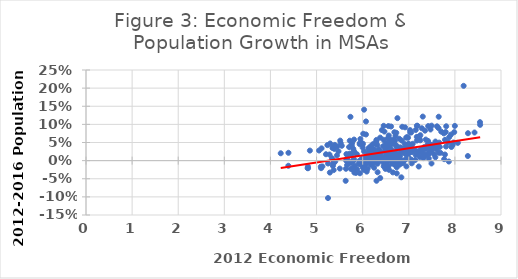
| Category | 2012-2016 Population Growth |
|---|---|
| 8.547669605840008 | 0.099 |
| 8.544558031174619 | 0.106 |
| 8.425552058119893 | 0.078 |
| 8.283765208355723 | 0.076 |
| 8.281198991280146 | 0.013 |
| 8.189887445923729 | 0.206 |
| 8.063717157255343 | 0.049 |
| 7.999061720572577 | 0.096 |
| 7.985514811354089 | 0.079 |
| 7.968329418094857 | 0.05 |
| 7.950647965060045 | 0.043 |
| 7.924628891524489 | 0.038 |
| 7.915038877419981 | 0.072 |
| 7.876693366457638 | 0.065 |
| 7.86836399496796 | -0.002 |
| 7.857229789867226 | 0.051 |
| 7.811855775583378 | 0.095 |
| 7.808392113529277 | 0.039 |
| 7.800807401070361 | 0.079 |
| 7.7856779822019915 | 0.057 |
| 7.784297718168427 | 0.017 |
| 7.76802720747049 | 0.004 |
| 7.76130980271395 | 0.075 |
| 7.703692062331889 | 0.08 |
| 7.68798869664089 | 0.022 |
| 7.672542301662936 | 0.038 |
| 7.659852269930613 | 0.05 |
| 7.649049603527929 | 0.121 |
| 7.6463544825522005 | 0.09 |
| 7.645356883772604 | 0.022 |
| 7.631316115166338 | 0.044 |
| 7.612484425216233 | 0.095 |
| 7.605202185658097 | 0.031 |
| 7.593386969901714 | 0.036 |
| 7.5783485359729355 | 0.053 |
| 7.57633929768339 | 0.009 |
| 7.5475867676369495 | 0.018 |
| 7.514120883301267 | 0.043 |
| 7.508226858432672 | 0.03 |
| 7.505839011236856 | 0.041 |
| 7.495153093302373 | 0.096 |
| 7.4927283026379 | -0.008 |
| 7.475423852071773 | 0.025 |
| 7.471544550846338 | 0.086 |
| 7.466157010850199 | 0.045 |
| 7.44808455889028 | 0.033 |
| 7.446167987069555 | 0.022 |
| 7.434300881554347 | 0.006 |
| 7.427764579528637 | 0.018 |
| 7.421302916763621 | 0.095 |
| 7.417797387675208 | 0.054 |
| 7.4175763491399564 | 0.018 |
| 7.412345754365745 | 0.046 |
| 7.375841914394948 | 0.032 |
| 7.367595836876464 | 0.058 |
| 7.360267132458676 | 0.014 |
| 7.351907599767382 | 0.083 |
| 7.3469118442699894 | 0.016 |
| 7.346394580717287 | 0.017 |
| 7.331465079610901 | 0.037 |
| 7.327701090492096 | 0.011 |
| 7.315223207024147 | 0.007 |
| 7.3137798713008495 | 0.029 |
| 7.311078226762 | 0.032 |
| 7.303639480430417 | 0.121 |
| 7.297022599344106 | 0.019 |
| 7.28350548262397 | 0.089 |
| 7.2662860216238805 | 0.032 |
| 7.2510288073399805 | 0.07 |
| 7.249495159921824 | 0.056 |
| 7.238424254905876 | 0.01 |
| 7.238014128534135 | 0.025 |
| 7.228785146976698 | 0.062 |
| 7.216069384420103 | -0.016 |
| 7.201415285089325 | 0.065 |
| 7.198617963042934 | 0.021 |
| 7.187433268926689 | 0.096 |
| 7.183200584834012 | 0.026 |
| 7.175527467051642 | 0.096 |
| 7.175362579276819 | 0.055 |
| 7.17402362464856 | 0.065 |
| 7.151040885092672 | 0.085 |
| 7.149792978851026 | 0.016 |
| 7.137467368012082 | 0.002 |
| 7.117897161098003 | 0.031 |
| 7.085226669010072 | 0.046 |
| 7.070506973346759 | 0.024 |
| 7.065093940520967 | -0.007 |
| 7.055343317890174 | 0.003 |
| 7.052434076570314 | 0.078 |
| 7.047514976771905 | 0.036 |
| 7.037143794303165 | 0.032 |
| 7.032391015710448 | 0.042 |
| 7.030134270597512 | 0.078 |
| 7.03004587106111 | 0.024 |
| 7.028730537199991 | 0.084 |
| 7.025341088699817 | 0.002 |
| 7.012577109296752 | 0.023 |
| 7.001533597818828 | 0.047 |
| 6.9948245898559405 | 0.031 |
| 6.991969155392204 | 0.009 |
| 6.991484366961411 | 0.024 |
| 6.98800452388469 | 0.019 |
| 6.9874308370614 | 0.008 |
| 6.984529803917301 | 0.063 |
| 6.979498012937747 | 0.045 |
| 6.963399462349867 | 0.039 |
| 6.961431166691342 | 0.065 |
| 6.948406250728984 | -0.016 |
| 6.9438587724735 | 0.063 |
| 6.934556178911188 | 0.018 |
| 6.932207004158857 | 0.004 |
| 6.920453597990068 | 0.092 |
| 6.9181771233803735 | 0.045 |
| 6.913835101646896 | 0.026 |
| 6.913390513714955 | 0.033 |
| 6.9014718608312515 | 0.032 |
| 6.896462780784286 | 0 |
| 6.884849224660805 | 0.023 |
| 6.876605275658889 | -0.006 |
| 6.870347723793235 | -0.001 |
| 6.8687135238847645 | 0.023 |
| 6.861958220338586 | 0.032 |
| 6.857908693648871 | 0.093 |
| 6.851856641075114 | 0.055 |
| 6.850998417731019 | -0.007 |
| 6.839001400390121 | -0.046 |
| 6.829329968863719 | 0.028 |
| 6.823510014047835 | 0.036 |
| 6.81521813401784 | 0.001 |
| 6.8138071406698115 | 0.036 |
| 6.811168908091095 | 0.012 |
| 6.801522815642833 | -0.011 |
| 6.795660789281947 | 0.06 |
| 6.793772711775245 | 0.019 |
| 6.782890427894834 | 0.004 |
| 6.7611498104793855 | 0.007 |
| 6.754582241184242 | -0.003 |
| 6.754060758298377 | 0.117 |
| 6.751582841808173 | 0.039 |
| 6.744478594480946 | 0.035 |
| 6.739628625823966 | -0.018 |
| 6.739572222222448 | -0.035 |
| 6.736763896285094 | -0.003 |
| 6.7298627355306335 | 0.077 |
| 6.715053123041834 | -0.013 |
| 6.713334165825381 | 0.015 |
| 6.711864027256374 | 0.068 |
| 6.709627885846807 | 0.044 |
| 6.709356486702831 | 0.013 |
| 6.708841848423039 | 0.022 |
| 6.70575354968313 | 0.007 |
| 6.696538571825786 | 0.054 |
| 6.696137444951894 | -0.007 |
| 6.696109404816949 | 0.024 |
| 6.6923160062602705 | 0.003 |
| 6.68947085059447 | -0.011 |
| 6.68721867504465 | 0.078 |
| 6.684653109790052 | -0.007 |
| 6.681065631811428 | 0.051 |
| 6.678379827378461 | 0.058 |
| 6.673988409514358 | 0.003 |
| 6.671365262111656 | 0.047 |
| 6.659532807539173 | 0.02 |
| 6.654410596778966 | -0.032 |
| 6.639025939684324 | -0.008 |
| 6.6383614781645015 | 0.007 |
| 6.636832294079466 | -0.003 |
| 6.629280514625708 | 0.024 |
| 6.627766938049625 | 0.023 |
| 6.624202590111893 | 0.001 |
| 6.6232207294376595 | -0.003 |
| 6.622824888618836 | 0.016 |
| 6.622247656752414 | 0.031 |
| 6.615939910463024 | 0.094 |
| 6.614612807717717 | 0.013 |
| 6.6132154479218 | 0.009 |
| 6.608852681213907 | 0.057 |
| 6.600584247296536 | 0.025 |
| 6.59912089079814 | 0.046 |
| 6.598645800663072 | 0.043 |
| 6.5844595886375785 | 0.016 |
| 6.582209204093805 | 0.007 |
| 6.581900834686395 | 0.058 |
| 6.578331114508092 | 0.003 |
| 6.573094011985204 | 0.045 |
| 6.570532596701438 | -0.025 |
| 6.5665906802321805 | 0.069 |
| 6.566186251874167 | 0.024 |
| 6.56599605723715 | 0.005 |
| 6.562295656590735 | 0.014 |
| 6.558895413756709 | 0.095 |
| 6.556502877083738 | -0.016 |
| 6.552819052197266 | 0.023 |
| 6.549004634115426 | 0.062 |
| 6.545999186145565 | 0.017 |
| 6.5447870787016456 | 0.038 |
| 6.542807663177058 | -0.016 |
| 6.54130789233603 | 0.008 |
| 6.534291683719515 | -0.018 |
| 6.528855557052598 | 0.024 |
| 6.527993973802102 | 0.046 |
| 6.524734763173842 | 0.044 |
| 6.520235355919156 | -0.011 |
| 6.519932288043997 | -0.005 |
| 6.518834900178553 | -0.015 |
| 6.517810813246061 | 0.038 |
| 6.5124297587767375 | -0.019 |
| 6.503930241051635 | 0.016 |
| 6.498084618038604 | 0.039 |
| 6.4977267763609765 | 0.049 |
| 6.494920600823529 | 0.03 |
| 6.494804013885098 | -0.023 |
| 6.489364327137849 | 0.029 |
| 6.472325470704257 | 0.08 |
| 6.468261006353999 | -0.011 |
| 6.46825344674792 | 0.001 |
| 6.456825566649165 | -0.016 |
| 6.45604711333701 | 0.096 |
| 6.453542289036636 | 0.058 |
| 6.4434326896779766 | 0.008 |
| 6.442463259279781 | 0.04 |
| 6.441280535471677 | 0.003 |
| 6.438179326172089 | 0.006 |
| 6.420376622451067 | 0.003 |
| 6.4163247099676575 | 0.084 |
| 6.415050248554889 | -0.001 |
| 6.402943207639854 | 0.022 |
| 6.400865389617713 | 0.009 |
| 6.381060175756488 | -0.048 |
| 6.3801634223425205 | 0.063 |
| 6.373018182936711 | 0.017 |
| 6.35659726155923 | 0.03 |
| 6.348706741000957 | 0.029 |
| 6.347613961418081 | 0.005 |
| 6.346272685102396 | 0.003 |
| 6.335933343485229 | 0.017 |
| 6.335090169366442 | 0.01 |
| 6.324067500240503 | -0.032 |
| 6.321999390341598 | -0.008 |
| 6.319791006734321 | 0.043 |
| 6.317656254372945 | 0.02 |
| 6.308854715617095 | 0.005 |
| 6.300113500399925 | -0.056 |
| 6.299275413861832 | 0.002 |
| 6.298483339757804 | 0.057 |
| 6.296633156447946 | 0.054 |
| 6.292585277334045 | 0.045 |
| 6.287249562472905 | 0.049 |
| 6.284816960129284 | -0.004 |
| 6.284469382797827 | 0.018 |
| 6.280269453393381 | 0.007 |
| 6.265564854678235 | 0.01 |
| 6.263709783219995 | -0.002 |
| 6.2479831393539795 | 0.025 |
| 6.247640763991 | -0.02 |
| 6.247555893446478 | 0.031 |
| 6.2385832338015215 | -0.004 |
| 6.235423122596795 | 0.003 |
| 6.22552216927386 | 0.001 |
| 6.22301472957002 | 0.045 |
| 6.214201550473658 | 0.004 |
| 6.212859939896365 | 0.01 |
| 6.205162872574252 | -0.011 |
| 6.202584100072766 | 0.024 |
| 6.197727701569138 | 0.014 |
| 6.1853878789545975 | 0.034 |
| 6.184259481830419 | -0.006 |
| 6.179680915400012 | 0.012 |
| 6.178393992866478 | 0.018 |
| 6.170695599603299 | 0.039 |
| 6.170066901603351 | -0.012 |
| 6.168809508537184 | -0.005 |
| 6.164899298052998 | 0.017 |
| 6.157147065231006 | 0.03 |
| 6.15621974638652 | 0.031 |
| 6.153805610203225 | 0 |
| 6.150457764462572 | 0.035 |
| 6.15028754732558 | 0.009 |
| 6.149961300970683 | 0.031 |
| 6.141321551219545 | 0.021 |
| 6.140143947485034 | 0.026 |
| 6.125476549135169 | 0.034 |
| 6.118355210732392 | 0.019 |
| 6.1093351846307895 | -0.022 |
| 6.0878916499389355 | -0.03 |
| 6.079983425146419 | 0.001 |
| 6.075873150852335 | -0.002 |
| 6.072060599938052 | 0.108 |
| 6.071571741168241 | 0.072 |
| 6.071278054243493 | 0.01 |
| 6.063687298555439 | -0.011 |
| 6.04055005906612 | -0.015 |
| 6.03095945151485 | 0.141 |
| 6.029865327722118 | 0.007 |
| 6.02954165373901 | 0.026 |
| 6.02566702766591 | -0.025 |
| 6.019956488937794 | -0.01 |
| 6.011981929480854 | 0.074 |
| 6.005505646162216 | 0.047 |
| 5.999886948968357 | -0.018 |
| 5.998568009383568 | 0.036 |
| 5.994126732752716 | 0.043 |
| 5.991942274182702 | -0.013 |
| 5.981420807002666 | 0.005 |
| 5.967337230844684 | 0.049 |
| 5.962967554289572 | -0.01 |
| 5.9500345951282485 | 0.06 |
| 5.944004567143055 | 0.049 |
| 5.94082563671192 | -0.035 |
| 5.9341374762230155 | 0.046 |
| 5.9306275966133235 | 0 |
| 5.92845200281807 | -0.005 |
| 5.9149502288399916 | -0.009 |
| 5.881472302961158 | -0.024 |
| 5.873905693282665 | 0.018 |
| 5.856048590992149 | -0.034 |
| 5.828983256201373 | -0.014 |
| 5.8192996569627375 | -0.033 |
| 5.814594004004616 | 0.003 |
| 5.813628443462097 | 0.022 |
| 5.813477849009165 | 0.058 |
| 5.8128920111586675 | 0.026 |
| 5.811746078178454 | -0.017 |
| 5.805107565178105 | -0.026 |
| 5.796301532873751 | 0.033 |
| 5.787657355873857 | -0.002 |
| 5.785387956325795 | -0.001 |
| 5.769005200127513 | 0.048 |
| 5.763990441515894 | 0.042 |
| 5.7527300170191324 | 0.017 |
| 5.7456106054943215 | -0.023 |
| 5.736458053024985 | -0.007 |
| 5.735564403257768 | 0.121 |
| 5.721803847820507 | 0.019 |
| 5.720253708599679 | 0.055 |
| 5.70569030519572 | 0.038 |
| 5.696866068760619 | -0.003 |
| 5.679008943625756 | -0.004 |
| 5.666693503937889 | 0.016 |
| 5.664385434079759 | 0.007 |
| 5.662710875378392 | -0.012 |
| 5.647435348383543 | 0.018 |
| 5.641224687335615 | 0 |
| 5.63733159652391 | -0.023 |
| 5.631552867393718 | -0.056 |
| 5.547221090665269 | 0.041 |
| 5.523362340467595 | 0.048 |
| 5.513223793787407 | 0.055 |
| 5.50394607638253 | -0.022 |
| 5.475082309386341 | 0.026 |
| 5.448173983223085 | 0.039 |
| 5.442413119697398 | 0.015 |
| 5.40524021116978 | -0.002 |
| 5.3961306471076105 | 0.043 |
| 5.3841272419571995 | 0.032 |
| 5.378759601234923 | -0.004 |
| 5.371107609536792 | -0.026 |
| 5.3647223961754555 | 0.038 |
| 5.36144752498728 | -0.008 |
| 5.354489677354832 | -0.015 |
| 5.344432945970117 | 0.035 |
| 5.334185547460087 | 0.007 |
| 5.295864285286115 | 0.047 |
| 5.288160850444615 | -0.033 |
| 5.280489173202455 | 0.017 |
| 5.24933084453487 | -0.008 |
| 5.248160802008255 | -0.103 |
| 5.234498967632533 | 0.043 |
| 5.204026836284252 | 0.018 |
| 5.127400522161479 | -0.016 |
| 5.108628138610114 | 0.034 |
| 5.098474580650676 | -0.021 |
| 5.091813580648098 | -0.017 |
| 5.054613408699638 | 0.028 |
| 4.855202309601115 | 0.028 |
| 4.814687920011284 | -0.021 |
| 4.813053550074803 | -0.016 |
| 4.806208196828305 | -0.021 |
| 4.390413973934148 | 0.022 |
| 4.388420989810296 | -0.014 |
| 4.223440588848788 | 0.02 |